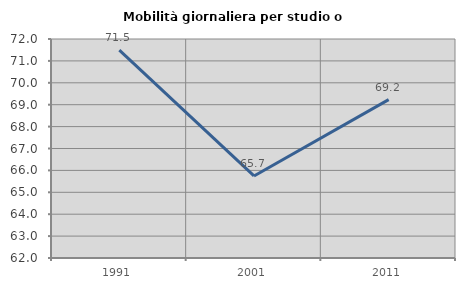
| Category | Mobilità giornaliera per studio o lavoro |
|---|---|
| 1991.0 | 71.493 |
| 2001.0 | 65.746 |
| 2011.0 | 69.231 |